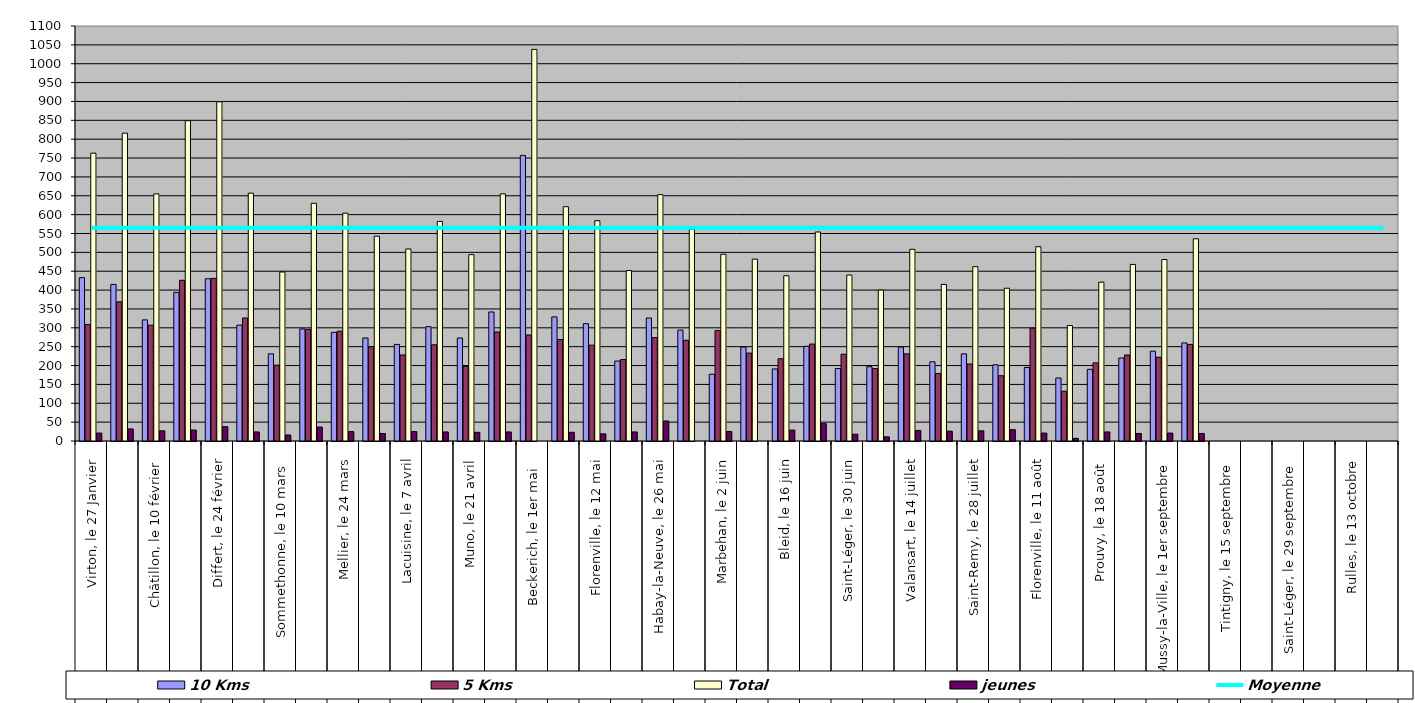
| Category | 10 Kms | 5 Kms | Total | jeunes |
|---|---|---|---|---|
| 0 | 433 | 309 | 763 | 21 |
| 1 | 415 | 369 | 816 | 32 |
| 2 | 321 | 307 | 655 | 27 |
| 3 | 394 | 426 | 849 | 29 |
| 4 | 430 | 431 | 899 | 38 |
| 5 | 307 | 326 | 657 | 24 |
| 6 | 231 | 201 | 448 | 16 |
| 7 | 297 | 296 | 630 | 37 |
| 8 | 288 | 291 | 604 | 25 |
| 9 | 273 | 250 | 543 | 20 |
| 10 | 256 | 228 | 509 | 25 |
| 11 | 303 | 255 | 582 | 24 |
| 12 | 273 | 198 | 494 | 23 |
| 13 | 342 | 289 | 655 | 24 |
| 14 | 757 | 281 | 1038 | 0 |
| 15 | 329 | 269 | 621 | 23 |
| 16 | 311 | 254 | 584 | 19 |
| 17 | 212 | 216 | 452 | 24 |
| 18 | 326 | 274 | 653 | 53 |
| 19 | 294 | 267 | 561 | 0 |
| 20 | 177 | 293 | 495 | 25 |
| 21 | 249 | 233 | 482 | 0 |
| 22 | 191 | 218 | 438 | 29 |
| 23 | 251 | 257 | 554 | 46 |
| 24 | 192 | 230 | 440 | 18 |
| 25 | 197 | 192 | 400 | 11 |
| 26 | 249 | 231 | 508 | 28 |
| 27 | 210 | 179 | 415 | 26 |
| 28 | 231 | 204 | 462 | 27 |
| 29 | 202 | 173 | 405 | 30 |
| 30 | 195 | 299 | 515 | 21 |
| 31 | 167 | 132 | 306 | 7 |
| 32 | 190 | 207 | 421 | 24 |
| 33 | 220 | 228 | 468 | 20 |
| 34 | 238 | 222 | 481 | 21 |
| 35 | 260 | 256 | 536 | 20 |
| 36 | 0 | 0 | 0 | 0 |
| 37 | 0 | 0 | 0 | 0 |
| 38 | 0 | 0 | 0 | 0 |
| 39 | 0 | 0 | 0 | 0 |
| 40 | 0 | 0 | 0 | 0 |
| 41 | 0 | 0 | 0 | 0 |